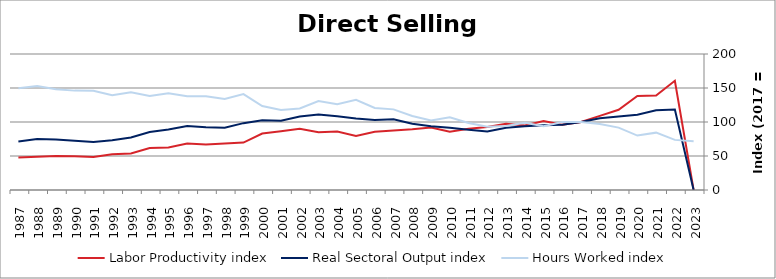
| Category | Labor Productivity index | Real Sectoral Output index | Hours Worked index |
|---|---|---|---|
| 2023.0 | 0 | 0 | 71.702 |
| 2022.0 | 160.62 | 118.373 | 73.697 |
| 2021.0 | 138.946 | 117.177 | 84.333 |
| 2020.0 | 138.417 | 110.783 | 80.036 |
| 2019.0 | 118.026 | 108.233 | 91.702 |
| 2018.0 | 108.967 | 105.66 | 96.965 |
| 2017.0 | 100 | 100 | 100 |
| 2016.0 | 95.94 | 95.86 | 99.916 |
| 2015.0 | 101.351 | 95.05 | 93.783 |
| 2014.0 | 94.82 | 93.713 | 98.833 |
| 2013.0 | 97.404 | 91.614 | 94.056 |
| 2012.0 | 92.586 | 86.08 | 92.973 |
| 2011.0 | 90.071 | 88.729 | 98.51 |
| 2010.0 | 85.568 | 91.581 | 107.027 |
| 2009.0 | 91.809 | 93.748 | 102.112 |
| 2008.0 | 89.415 | 97.298 | 108.817 |
| 2007.0 | 87.668 | 103.947 | 118.569 |
| 2006.0 | 85.503 | 103.069 | 120.544 |
| 2005.0 | 79.406 | 105.291 | 132.597 |
| 2004.0 | 86.005 | 108.442 | 126.088 |
| 2003.0 | 84.783 | 110.863 | 130.76 |
| 2002.0 | 90.209 | 108.231 | 119.979 |
| 2001.0 | 86.436 | 101.744 | 117.71 |
| 2000.0 | 83.069 | 102.642 | 123.563 |
| 1999.0 | 69.696 | 98.304 | 141.046 |
| 1998.0 | 68.303 | 91.42 | 133.844 |
| 1997.0 | 66.902 | 92.334 | 138.015 |
| 1996.0 | 68.319 | 94.242 | 137.944 |
| 1995.0 | 62.445 | 88.909 | 142.379 |
| 1994.0 | 61.783 | 85.373 | 138.183 |
| 1993.0 | 53.761 | 77.238 | 143.668 |
| 1992.0 | 52.592 | 73.27 | 139.317 |
| 1991.0 | 48.401 | 70.575 | 145.813 |
| 1990.0 | 49.595 | 72.478 | 146.14 |
| 1989.0 | 50.159 | 74.289 | 148.107 |
| 1988.0 | 49.002 | 74.945 | 152.943 |
| 1987.0 | 47.668 | 71.251 | 149.473 |